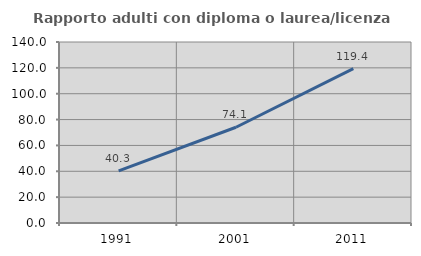
| Category | Rapporto adulti con diploma o laurea/licenza media  |
|---|---|
| 1991.0 | 40.327 |
| 2001.0 | 74.054 |
| 2011.0 | 119.375 |